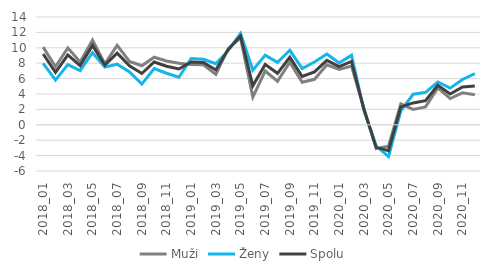
| Category | Muži | Ženy | Spolu |
|---|---|---|---|
| 2018_01 | 10.088 | 7.976 | 9.197 |
| 2018_02 | 7.537 | 5.802 | 6.808 |
| 2018_03 | 9.987 | 7.809 | 9.081 |
| 2018_04 | 8.155 | 7.032 | 7.688 |
| 2018_05 | 10.997 | 9.369 | 10.316 |
| 2018_06 | 7.931 | 7.495 | 7.749 |
| 2018_07 | 10.318 | 7.874 | 9.299 |
| 2018_08 | 8.233 | 6.864 | 7.662 |
| 2018_09 | 7.67 | 5.282 | 6.664 |
| 2018_10 | 8.779 | 7.3 | 8.154 |
| 2018_11 | 8.295 | 6.695 | 7.612 |
| 2018_12 | 8.002 | 6.18 | 7.245 |
| 2019_01 | 7.84 | 8.614 | 8.166 |
| 2019_02 | 7.79 | 8.511 | 8.093 |
| 2019_03 | 6.546 | 7.927 | 7.119 |
| 2019_04 | 9.88 | 9.628 | 9.775 |
| 2019_05 | 11.3 | 11.859 | 11.534 |
| 2019_06 | 3.605 | 7.104 | 5.08 |
| 2019_07 | 6.989 | 9.05 | 7.846 |
| 2019_08 | 5.661 | 8.106 | 6.684 |
| 2019_09 | 8.133 | 9.679 | 8.783 |
| 2019_10 | 5.528 | 7.292 | 6.275 |
| 2019_11 | 5.911 | 8.159 | 6.872 |
| 2019_12 | 7.791 | 9.185 | 8.372 |
| 2020_01 | 7.197 | 8.018 | 7.548 |
| 2020_02 | 7.622 | 9.03 | 8.223 |
| 2020_03 | 2.167 | 1.907 | 2.057 |
| 2020_04 | -3.079 | -2.731 | -2.933 |
| 2020_05 | -2.773 | -4.135 | -3.35 |
| 2020_06 | 2.717 | 1.802 | 2.321 |
| 2020_07 | 2.006 | 3.966 | 2.839 |
| 2020_08 | 2.32 | 4.208 | 3.127 |
| 2020_09 | 4.791 | 5.559 | 5.121 |
| 2020_10 | 3.411 | 4.765 | 3.992 |
| 2020_11 | 4.145 | 5.885 | 4.901 |
| 2020_12 | 3.891 | 6.633 | 5.043 |